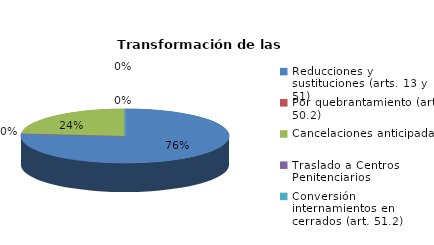
| Category | Series 0 |
|---|---|
| Reducciones y sustituciones (arts. 13 y 51) | 13 |
| Por quebrantamiento (art. 50.2) | 0 |
| Cancelaciones anticipadas | 4 |
| Traslado a Centros Penitenciarios | 0 |
| Conversión internamientos en cerrados (art. 51.2) | 0 |